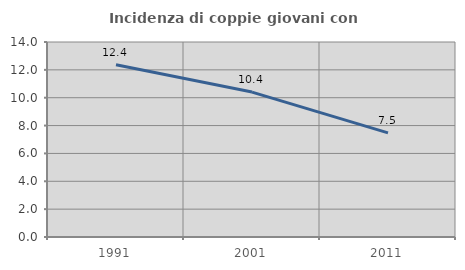
| Category | Incidenza di coppie giovani con figli |
|---|---|
| 1991.0 | 12.366 |
| 2001.0 | 10.405 |
| 2011.0 | 7.471 |